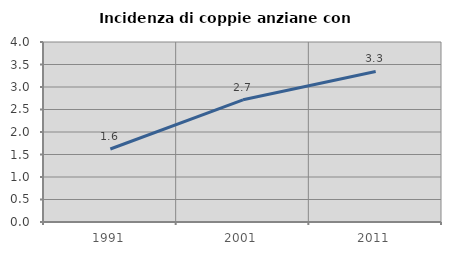
| Category | Incidenza di coppie anziane con figli |
|---|---|
| 1991.0 | 1.622 |
| 2001.0 | 2.715 |
| 2011.0 | 3.345 |